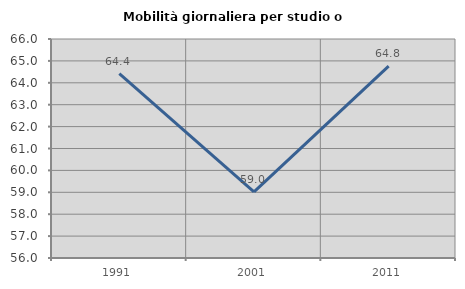
| Category | Mobilità giornaliera per studio o lavoro |
|---|---|
| 1991.0 | 64.423 |
| 2001.0 | 59.023 |
| 2011.0 | 64.758 |